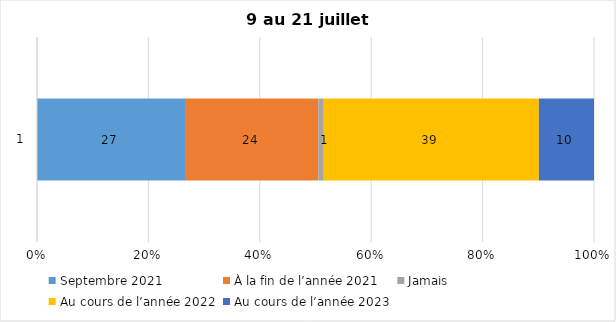
| Category | Septembre 2021 | À la fin de l’année 2021 | Jamais | Au cours de l’année 2022 | Au cours de l’année 2023 |
|---|---|---|---|---|---|
| 0 | 27 | 24 | 1 | 39 | 10 |